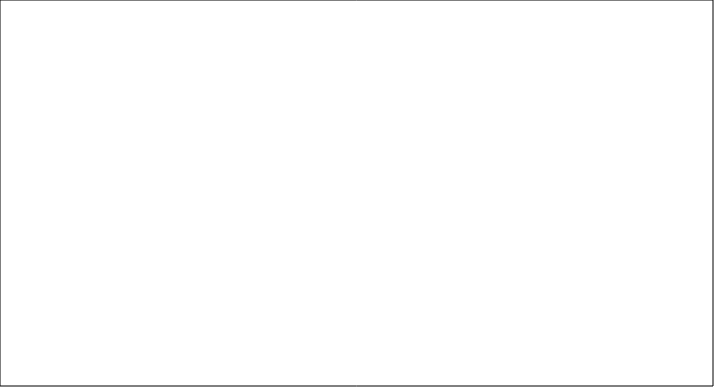
| Category | Number of Children |
|---|---|
| Start Sep 2024 | 0 |
| Start Sep 2023 | 0 |
| Start Sep 2022 | 0 |
| Start Sep 2021 | 0 |
| Start Sep 2020 | 0 |
| Year R | 0 |
| Year 1 | 0 |
| Year 2 | 0 |
| Year 3 | 0 |
| Year 4 | 0 |
| Year 5 | 0 |
| Year 6 | 0 |
| Year 7 | 0 |
| Year 8 | 0 |
| Year 9 | 0 |
| Year 10 | 0 |
| Year 11 | 0 |
| Year 12 | 0 |
| Year 13 | 0 |
| Out of School | 0 |